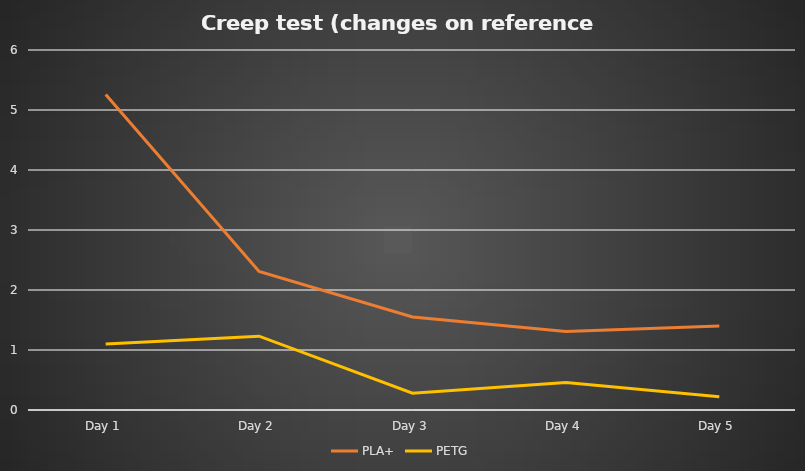
| Category | PLA+ | PETG |
|---|---|---|
| Day 1 | 5.26 | 1.1 |
| Day 2 | 2.31 | 1.23 |
| Day 3 | 1.55 | 0.28 |
| Day 4 | 1.31 | 0.46 |
| Day 5 | 1.4 | 0.22 |